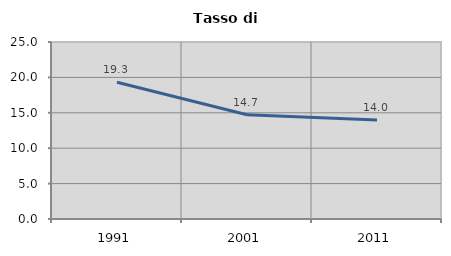
| Category | Tasso di disoccupazione   |
|---|---|
| 1991.0 | 19.313 |
| 2001.0 | 14.714 |
| 2011.0 | 13.989 |